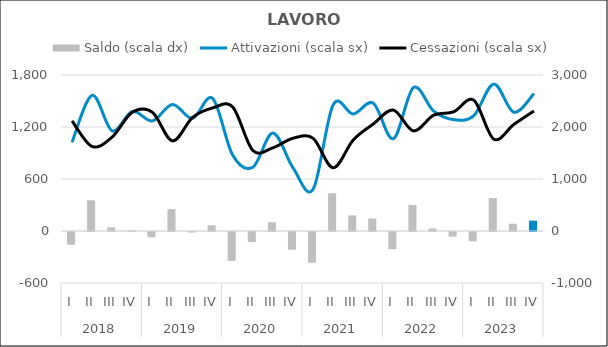
| Category | Saldo (scala dx) |
|---|---|
| 0 | -245 |
| 1 | 590 |
| 2 | 70 |
| 3 | 10 |
| 4 | -100 |
| 5 | 420 |
| 6 | -10 |
| 7 | 110 |
| 8 | -555 |
| 9 | -195 |
| 10 | 170 |
| 11 | -340 |
| 12 | -590 |
| 13 | 725 |
| 14 | 300 |
| 15 | 240 |
| 16 | -330 |
| 17 | 500 |
| 18 | 50 |
| 19 | -90 |
| 20 | -180 |
| 21 | 635 |
| 22 | 140 |
| 23 | 200 |